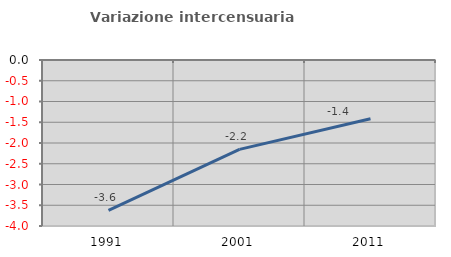
| Category | Variazione intercensuaria annua |
|---|---|
| 1991.0 | -3.624 |
| 2001.0 | -2.153 |
| 2011.0 | -1.417 |